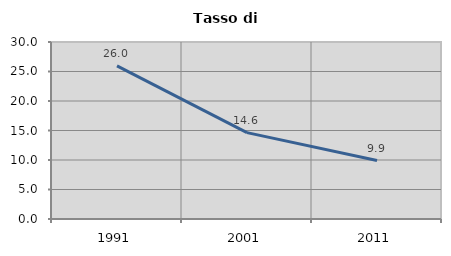
| Category | Tasso di disoccupazione   |
|---|---|
| 1991.0 | 25.962 |
| 2001.0 | 14.644 |
| 2011.0 | 9.901 |